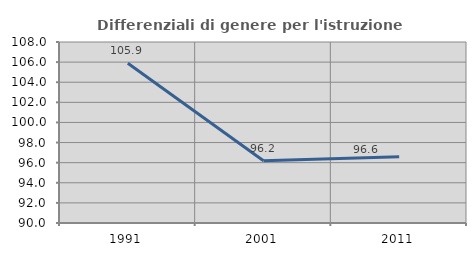
| Category | Differenziali di genere per l'istruzione superiore |
|---|---|
| 1991.0 | 105.887 |
| 2001.0 | 96.186 |
| 2011.0 | 96.6 |